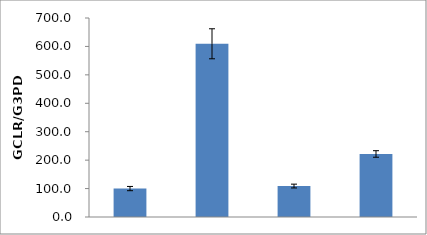
| Category | Series 0 |
|---|---|
| 0 | 100 |
| 1 | 609.321 |
| 2 | 108.849 |
| 3 | 221.721 |